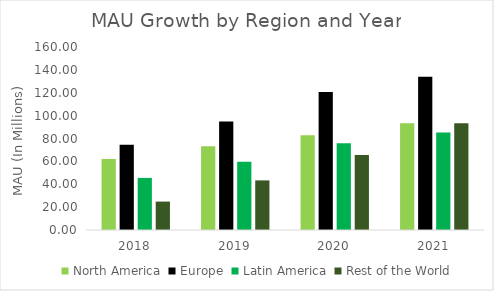
| Category | North America | Europe | Latin America | Rest of the World |
|---|---|---|---|---|
| 2018.0 | 62.1 | 74.52 | 45.54 | 24.84 |
| 2019.0 | 73.17 | 94.85 | 59.62 | 43.36 |
| 2020.0 | 82.8 | 120.75 | 75.9 | 65.55 |
| 2021.0 | 93.38 | 133.98 | 85.26 | 93.38 |